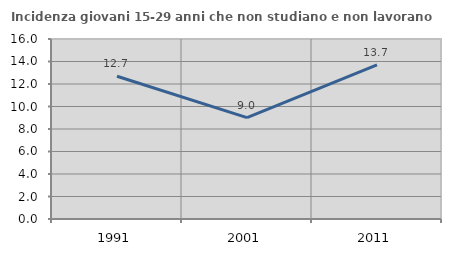
| Category | Incidenza giovani 15-29 anni che non studiano e non lavorano  |
|---|---|
| 1991.0 | 12.693 |
| 2001.0 | 9.013 |
| 2011.0 | 13.694 |